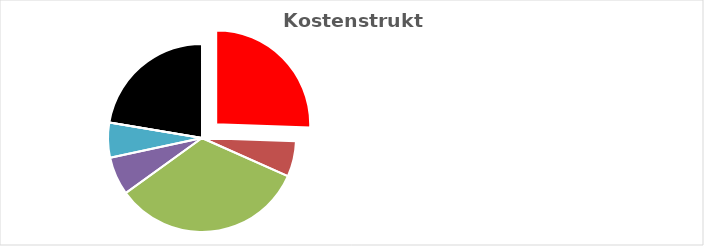
| Category | Series 0 |
|---|---|
| KV-Entgelt produktiv Tätige | 1 |
| Weitere Personalkosten produktiv | 0.239 |
| Personalnebenkosten | 1.307 |
| Unproduktives Personal | 0.258 |
| Deckung Personalgemeinkosten | 0.236 |
| Umlagen ohne GZ | 0 |
| Gesamtzuschlag | 0.875 |